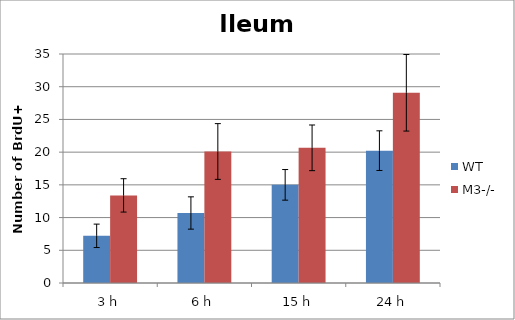
| Category | WT | M3-/- |
|---|---|---|
| 3 h | 7.21 | 13.39 |
| 6 h | 10.7 | 20.1 |
| 15 h | 15 | 20.66 |
| 24 h | 20.23 | 29.07 |